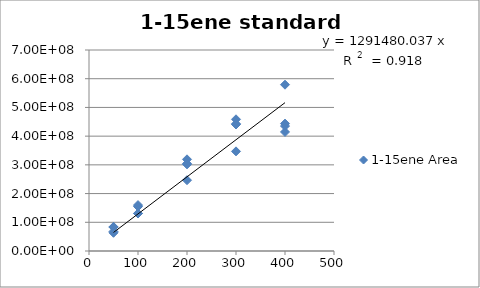
| Category | 1-15ene Area |
|---|---|
| 400.0 | 414544204 |
| 400.0 | 435168204 |
| 400.0 | 579190476 |
| 400.0 | 443674362 |
| 300.0 | 458633511 |
| 300.0 | 346986780 |
| 300.0 | 440564914 |
| 300.0 | 442893353 |
| 200.0 | 319207466 |
| 200.0 | 246576969 |
| 200.0 | 304246974 |
| 200.0 | 301860498 |
| 100.0 | 130583440 |
| 100.0 | 154984242 |
| 100.0 | 130920783 |
| 100.0 | 159911172 |
| 50.0 | 82834836 |
| 50.0 | 84223126 |
| 50.0 | 67896364 |
| 50.0 | 63406361 |